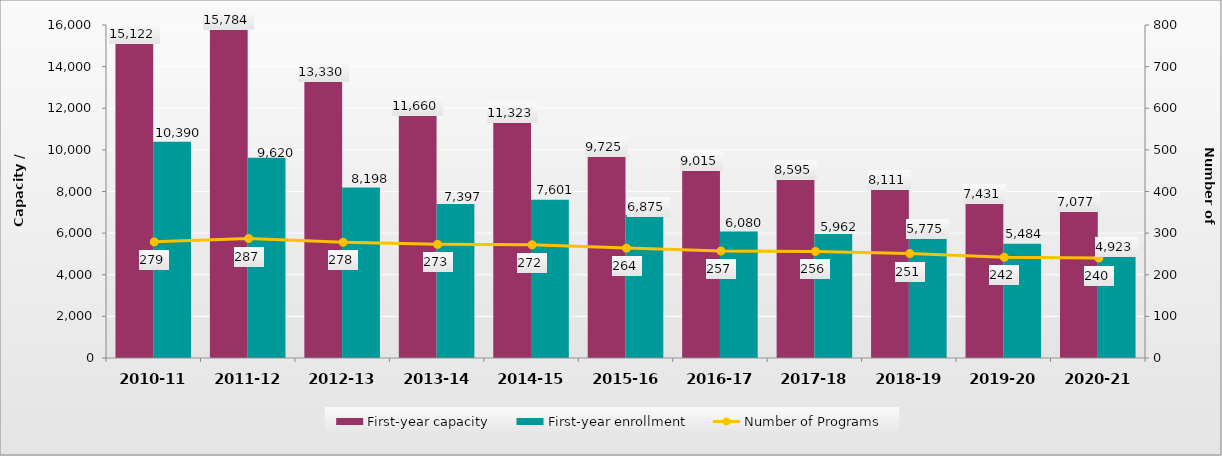
| Category | First-year capacity | First-year enrollment |
|---|---|---|
| 2010-11 | 15122 | 10390 |
| 2011-12 | 15784 | 9620 |
| 2012-13 | 13330 | 8198 |
| 2013-14 | 11660 | 7397 |
| 2014-15 | 11323 | 7601 |
| 2015-16 | 9725 | 6875 |
| 2016-17 | 9015 | 6080 |
| 2017-18 | 8595 | 5962 |
| 2018-19 | 8111 | 5775 |
| 2019-20 | 7431 | 5484 |
| 2020-21 | 7077 | 4923 |